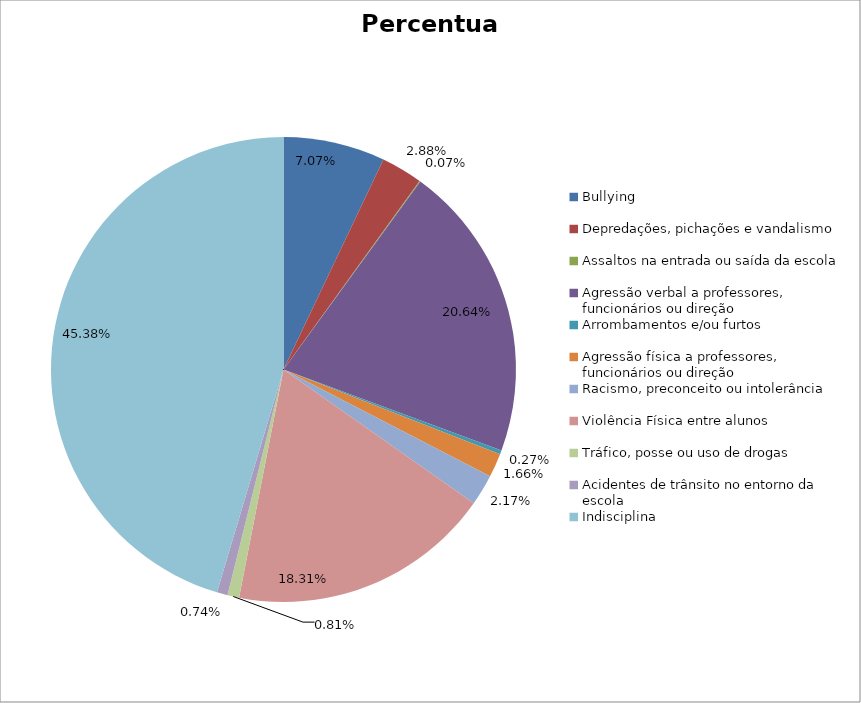
| Category | Percentual |
|---|---|
| Bullying | 0.071 |
| Depredações, pichações e vandalismo | 0.029 |
| Assaltos na entrada ou saída da escola | 0.001 |
| Agressão verbal a professores, funcionários ou direção | 0.206 |
| Arrombamentos e/ou furtos | 0.003 |
| Agressão física a professores, funcionários ou direção | 0.017 |
| Racismo, preconceito ou intolerância | 0.022 |
| Violência Física entre alunos | 0.183 |
| Tráfico, posse ou uso de drogas | 0.008 |
| Acidentes de trânsito no entorno da escola | 0.007 |
| Indisciplina | 0.454 |